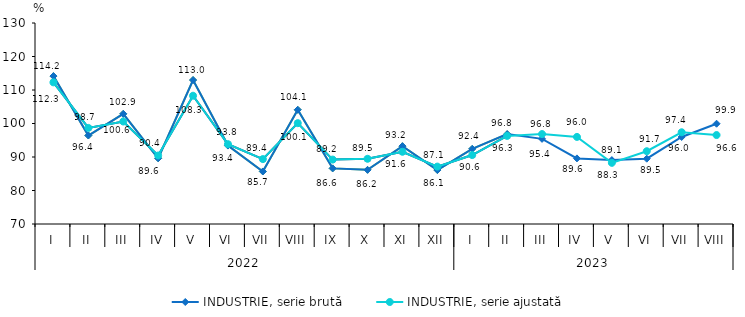
| Category | INDUSTRIE, serie brută | INDUSTRIE, serie ajustată |
|---|---|---|
| 0 | 114.151 | 112.283 |
| 1 | 96.419 | 98.68 |
| 2 | 102.886 | 100.594 |
| 3 | 89.614 | 90.447 |
| 4 | 112.973 | 108.294 |
| 5 | 93.417 | 93.82 |
| 6 | 85.678 | 89.372 |
| 7 | 104.099 | 100.102 |
| 8 | 86.603 | 89.228 |
| 9 | 86.164 | 89.466 |
| 10 | 93.241 | 91.558 |
| 11 | 86.103 | 87.134 |
| 12 | 92.442 | 90.58 |
| 13 | 96.83 | 96.297 |
| 14 | 95.412 | 96.841 |
| 15 | 89.583 | 95.998 |
| 16 | 89.076 | 88.254 |
| 17 | 89.492 | 91.722 |
| 18 | 95.973 | 97.381 |
| 19 | 99.933 | 96.554 |